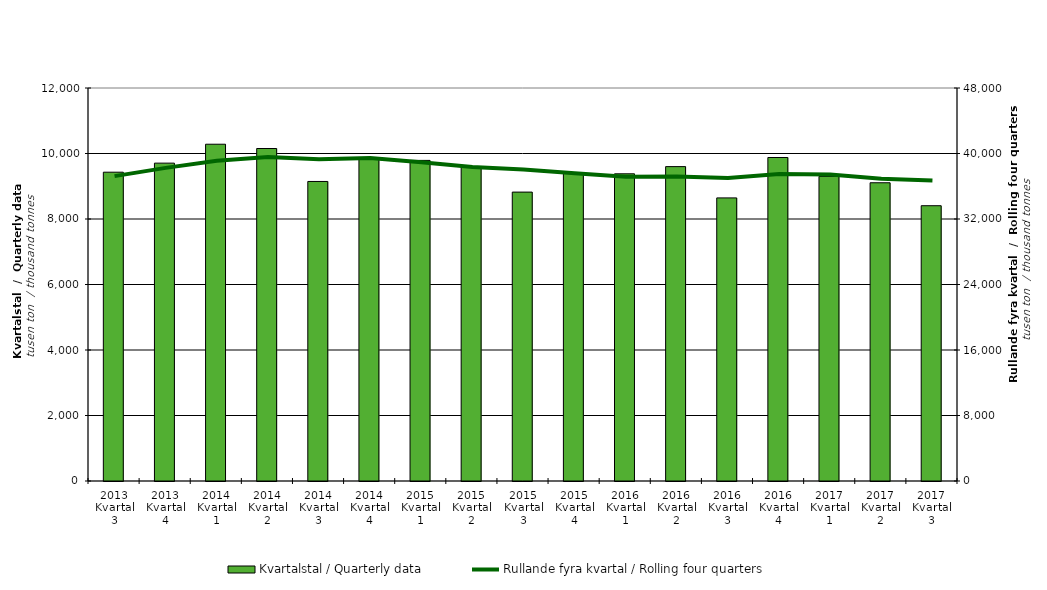
| Category | Kvartalstal / Quarterly data |
|---|---|
| 2013 Kvartal 3 | 9429.357 |
| 2013 Kvartal 4 | 9705.756 |
| 2014 Kvartal 1 | 10283.241 |
| 2014 Kvartal 2 | 10152.427 |
| 2014 Kvartal 3 | 9146.144 |
| 2014 Kvartal 4 | 9854.974 |
| 2015 Kvartal 1 | 9789.197 |
| 2015 Kvartal 2 | 9575.074 |
| 2015 Kvartal 3 | 8821.293 |
| 2015 Kvartal 4 | 9393.444 |
| 2016 Kvartal 1 | 9380.116 |
| 2016 Kvartal 2 | 9599.604 |
| 2016 Kvartal 3 | 8644.131 |
| 2016 Kvartal 4 | 9877.426 |
| 2017 Kvartal 1 | 9301.931 |
| 2017 Kvartal 2 | 9106.481 |
| 2017 Kvartal 3 | 8405.871 |